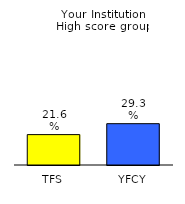
| Category | Series 0 |
|---|---|
| TFS | 0.216 |
| YFCY | 0.293 |